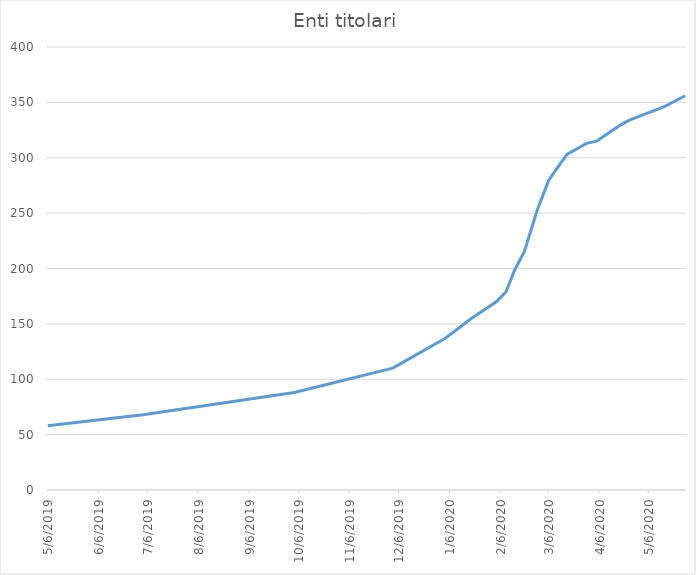
| Category | Enti titolari |
|---|---|
| 5/6/19 | 58 |
| 7/3/19 | 68 |
| 10/3/19 | 88 |
| 12/2/19 | 110 |
| 1/3/20 | 137 |
| 1/19/20 | 155 |
| 2/3/20 | 170 |
| 2/9/20 | 179 |
| 2/14/20 | 198 |
| 2/20/20 | 215 |
| 2/28/20 | 253 |
| 3/6/20 | 280 |
| 3/17/20 | 303 |
| 3/29/20 | 313 |
| 4/4/20 | 315 |
| 4/18/20 | 329 |
| 4/24/20 | 334 |
| 5/15/20 | 346 |
| 5/28/20 | 356 |